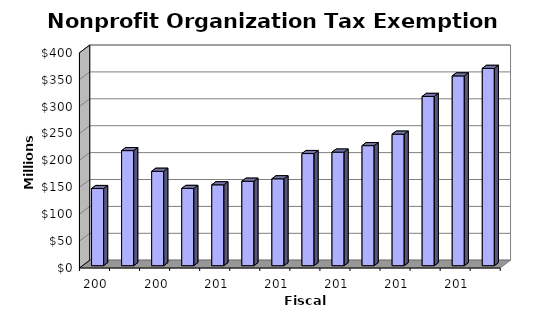
| Category | Amount ($) |
|---|---|
| 2007.0 | 143332331.225 |
| 2008.0 | 213829116.386 |
| 2009.0 | 175364334.919 |
| 2010.0 | 143554116.648 |
| 2011.0 | 150273915 |
| 2012.0 | 156945693.354 |
| 2013.0 | 161434467.789 |
| 2014.0 | 208366102.088 |
| 2015.0 | 210994603.365 |
| 2016.0 | 223074819.582 |
| 2017.0 | 244370076.328 |
| 2018.0 | 314543689.447 |
| 2019.0 | 352673576.32 |
| 2020.0 | 366646468.665 |